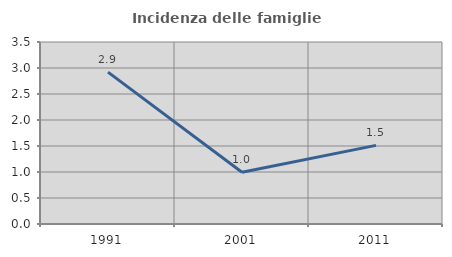
| Category | Incidenza delle famiglie numerose |
|---|---|
| 1991.0 | 2.921 |
| 2001.0 | 0.995 |
| 2011.0 | 1.512 |